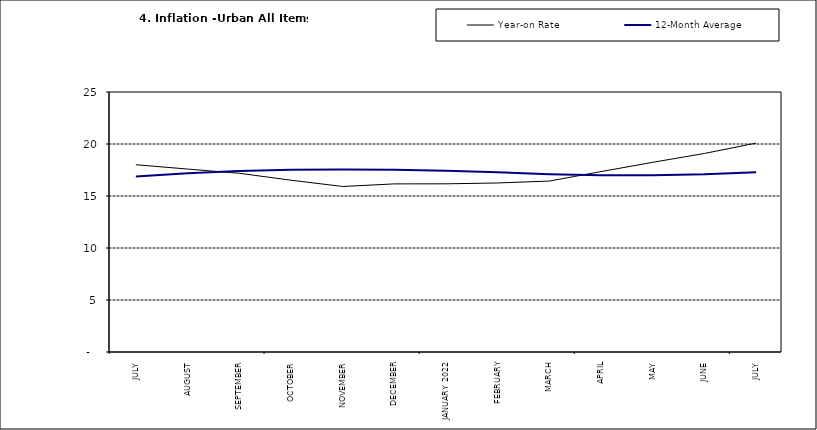
| Category | Year-on Rate | 12-Month Average |
|---|---|---|
| JULY | 18.007 | 16.886 |
| AUGUST | 17.59 | 17.187 |
| SEPTEMBER | 17.187 | 17.411 |
| OCTOBER | 16.52 | 17.534 |
| NOVEMBER | 15.916 | 17.55 |
| DECEMBER | 16.165 | 17.519 |
| JANUARY 2022 | 16.171 | 17.435 |
| FEBRUARY | 16.253 | 17.292 |
| MARCH | 16.438 | 17.103 |
| APRIL | 17.347 | 17.005 |
| MAY | 18.24 | 17.002 |
| JUNE | 19.093 | 17.087 |
| JULY | 20.087 | 17.285 |